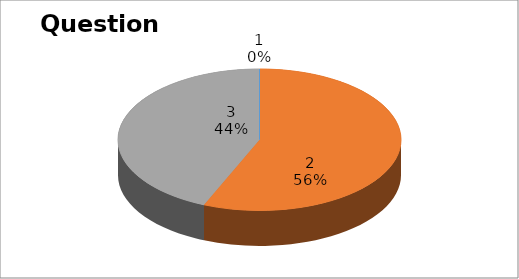
| Category | Series 0 |
|---|---|
| 0 | 0 |
| 1 | 22 |
| 2 | 17 |